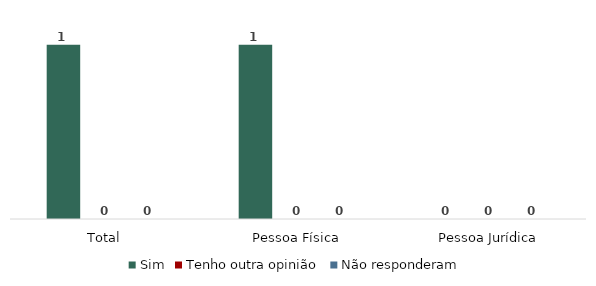
| Category | Sim | Tenho outra opinião | Não responderam |
|---|---|---|---|
| Total | 1 | 0 | 0 |
| Pessoa Física | 1 | 0 | 0 |
| Pessoa Jurídica | 0 | 0 | 0 |